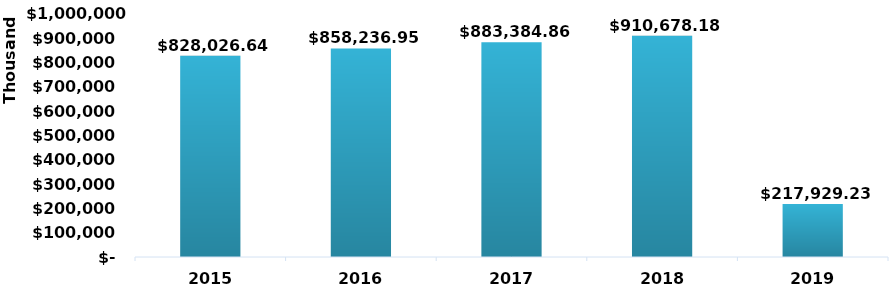
| Category | Total |
|---|---|
| 2015 | 828026638.67 |
| 2016 | 858236950.18 |
| 2017 | 883384864.92 |
| 2018 | 910678178.78 |
| 2019 | 217929233.04 |